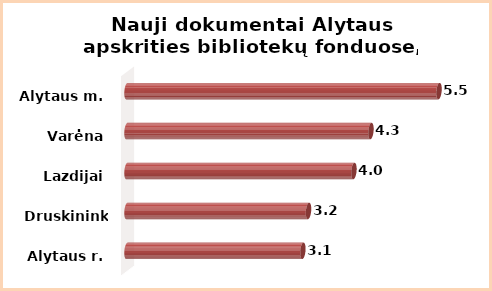
| Category | Series 0 |
|---|---|
| Alytaus r. | 3.1 |
| Druskininkai | 3.2 |
| Lazdijai | 4 |
| Varėna | 4.3 |
| Alytaus m. | 5.5 |